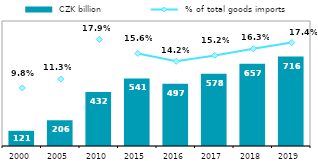
| Category |  CZK billion |
|---|---|
| 2000.0 | 121.259 |
| 2005.0 | 205.937 |
| 2010.0 | 432.179 |
| 2015.0 | 540.741 |
| 2016.0 | 497.037 |
| 2017.0 | 578.493 |
| 2018.0 | 657.289 |
| 2019.0 | 715.75 |